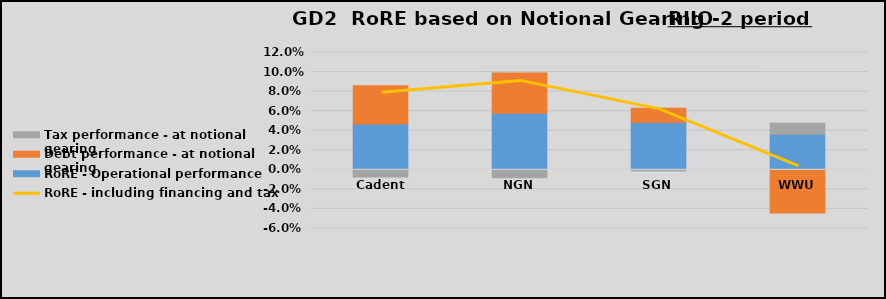
| Category | RoRE - Operational performance | Debt performance - at notional gearing | Tax performance - at notional gearing |
|---|---|---|---|
| Cadent | 0.047 | 0.039 | -0.007 |
| NGN | 0.058 | 0.041 | -0.008 |
| SGN | 0.049 | 0.015 | -0.001 |
| WWU | 0.036 | -0.044 | 0.011 |